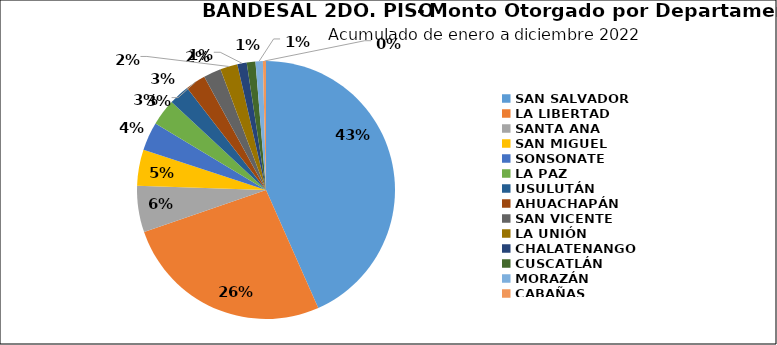
| Category | Monto | Créditos |
|---|---|---|
| SAN SALVADOR | 99.066 | 1722 |
| LA LIBERTAD | 60.185 | 849 |
| SANTA ANA | 13.323 | 391 |
| SAN MIGUEL | 10.323 | 577 |
| SONSONATE | 8.145 | 427 |
| LA PAZ | 7.56 | 348 |
| USULUTÁN | 5.925 | 433 |
| AHUACHAPÁN | 5.785 | 319 |
| SAN VICENTE | 5.033 | 209 |
| LA UNIÓN | 4.954 | 275 |
| CHALATENANGO | 2.69 | 98 |
| CUSCATLÁN | 2.487 | 219 |
| MORAZÁN | 2.109 | 140 |
| CABAÑAS | 0.876 | 17 |